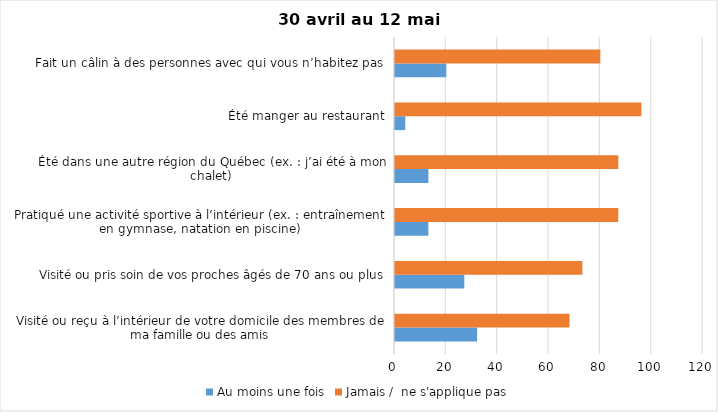
| Category | Au moins une fois | Jamais /  ne s'applique pas |
|---|---|---|
| Visité ou reçu à l’intérieur de votre domicile des membres de ma famille ou des amis | 32 | 68 |
| Visité ou pris soin de vos proches âgés de 70 ans ou plus | 27 | 73 |
| Pratiqué une activité sportive à l’intérieur (ex. : entraînement en gymnase, natation en piscine) | 13 | 87 |
| Été dans une autre région du Québec (ex. : j’ai été à mon chalet) | 13 | 87 |
| Été manger au restaurant | 4 | 96 |
| Fait un câlin à des personnes avec qui vous n’habitez pas | 20 | 80 |